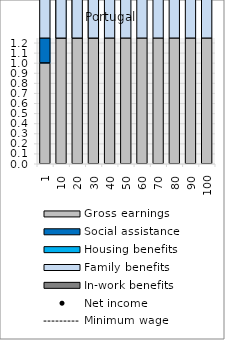
| Category | Gross earnings | Social assistance | Housing benefits | Family benefits | In-work benefits |
|---|---|---|---|---|---|
| 1.0 | 1 | 25.24 | 0 | 5.087 | 0 |
| 10.0 | 10.001 | 18.835 | 0 | 5.087 | 0 |
| 20.0 | 20.002 | 11.712 | 0 | 5.087 | 0 |
| 30.0 | 29.998 | 4.596 | 0 | 5.087 | 0 |
| 40.0 | 39.999 | 0 | 0 | 5.087 | 0 |
| 50.0 | 50 | 0 | 0 | 5.087 | 0 |
| 60.0 | 60.001 | 0 | 0 | 4.22 | 0 |
| 70.0 | 69.997 | 0 | 0 | 4.22 | 0 |
| 80.0 | 79.998 | 0 | 0 | 4.22 | 0 |
| 90.0 | 89.999 | 0 | 0 | 4.22 | 0 |
| 100.0 | 100 | 0 | 0 | 4.22 | 0 |